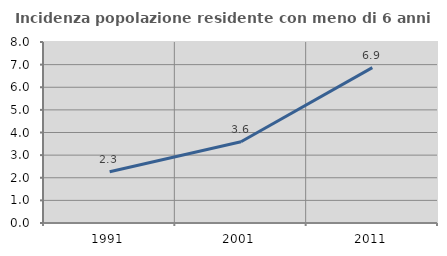
| Category | Incidenza popolazione residente con meno di 6 anni |
|---|---|
| 1991.0 | 2.266 |
| 2001.0 | 3.591 |
| 2011.0 | 6.868 |